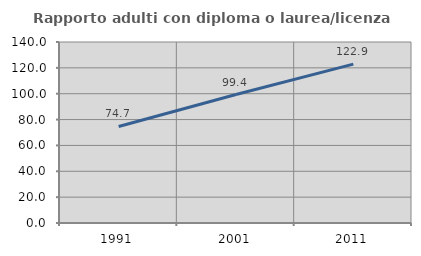
| Category | Rapporto adulti con diploma o laurea/licenza media  |
|---|---|
| 1991.0 | 74.686 |
| 2001.0 | 99.362 |
| 2011.0 | 122.897 |